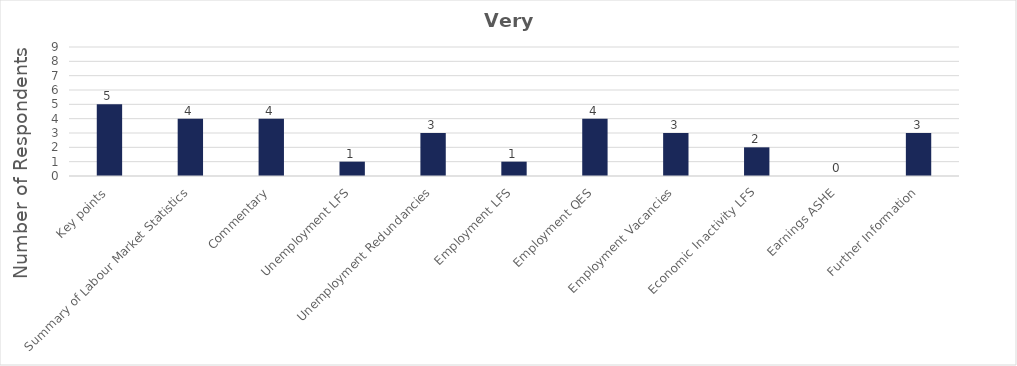
| Category | Very useful |
|---|---|
| Key points | 5 |
| Summary of Labour Market Statistics | 4 |
| Commentary | 4 |
| Unemployment LFS | 1 |
| Unemployment Redundancies | 3 |
| Employment LFS | 1 |
| Employment QES | 4 |
| Employment Vacancies | 3 |
| Economic Inactivity LFS | 2 |
| Earnings ASHE | 0 |
| Further Information | 3 |